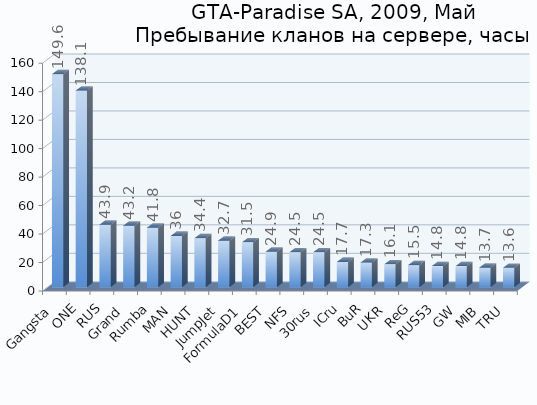
| Category | Series 0 |
|---|---|
| Gangsta | 149.6 |
| ONE | 138.1 |
| RUS | 43.9 |
| Grand | 43.2 |
| Rumba | 41.8 |
| MAN | 36 |
| HUNT | 34.4 |
| JumpJet | 32.7 |
| FormulaD1 | 31.5 |
| BEST | 24.9 |
| NFS | 24.5 |
| 30rus | 24.5 |
| ICru | 17.7 |
| BuR | 17.3 |
| UKR | 16.1 |
| ReG | 15.5 |
| RUS53 | 14.8 |
| GW | 14.8 |
| MIB | 13.7 |
| TRU | 13.6 |